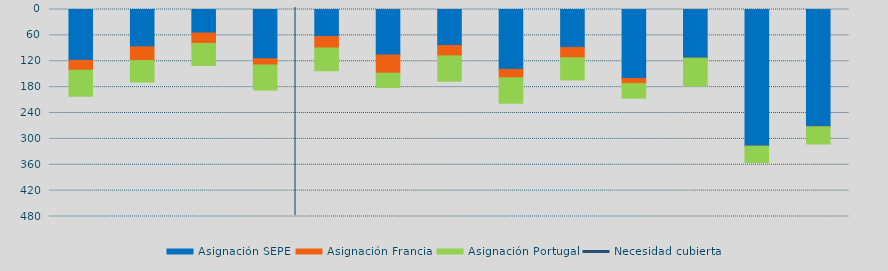
| Category | Asignación SEPE | Asignación Francia | Asignación Portugal |
|---|---|---|---|
| 0 | 117881.4 | 22871.5 | 60380.5 |
| 1 | 86621.2 | 31842.2 | 49868.6 |
| 2 | 54505.3 | 24354.5 | 51005.7 |
| 3 | 114103.8 | 14504.8 | 58082.9 |
| 4 | 62612.7 | 26635.4 | 52718.7 |
| 5 | 105519.2 | 42049.8 | 33318.5 |
| 6 | 83466.2 | 24132.5 | 58650.9 |
| 7 | 138850.6 | 19527.1 | 58931.4 |
| 8 | 88000.9 | 23926.8 | 51284.5 |
| 9 | 159946.5 | 11873.6 | 33973.4 |
| 10 | 112774.35 | 263.2 | 64888 |
| 11 | 316845.45 | 348.4 | 37996.4 |
| 12 | 271981.65 | 130 | 39763.3 |